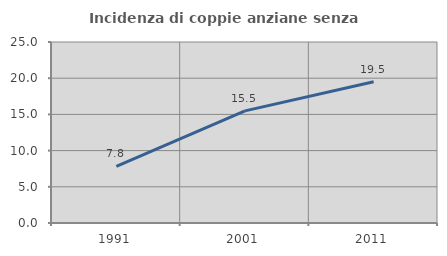
| Category | Incidenza di coppie anziane senza figli  |
|---|---|
| 1991.0 | 7.821 |
| 2001.0 | 15.485 |
| 2011.0 | 19.518 |